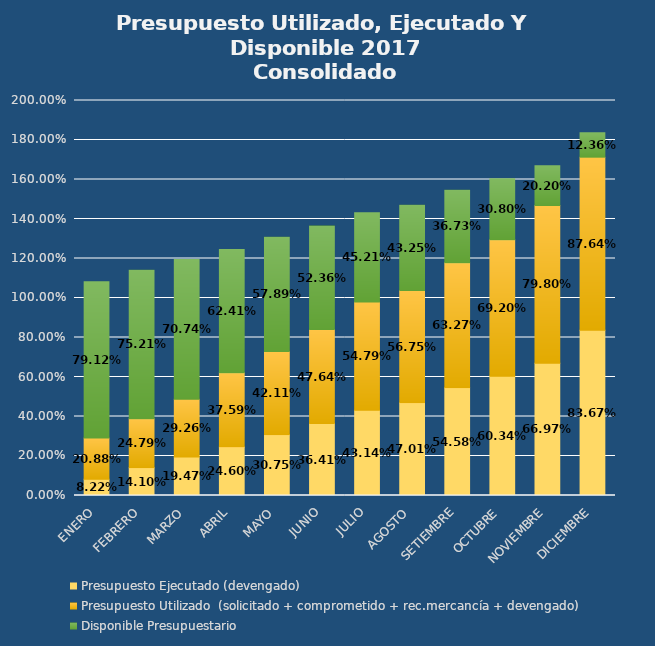
| Category | Presupuesto Ejecutado (devengado) | Presupuesto Utilizado  | Disponible Presupuestario |
|---|---|---|---|
| ENERO | 0.082 | 0.209 | 0.791 |
| FEBRERO | 0.141 | 0.248 | 0.752 |
| MARZO | 0.195 | 0.293 | 0.707 |
| ABRIL | 0.246 | 0.376 | 0.624 |
| MAYO | 0.308 | 0.421 | 0.579 |
| JUNIO | 0.364 | 0.476 | 0.524 |
| JULIO | 0.431 | 0.548 | 0.452 |
| AGOSTO | 0.47 | 0.567 | 0.433 |
| SETIEMBRE | 0.546 | 0.633 | 0.367 |
| OCTUBRE | 0.603 | 0.692 | 0.308 |
| NOVIEMBRE | 0.67 | 0.798 | 0.202 |
| DICIEMBRE | 0.837 | 0.876 | 0.124 |